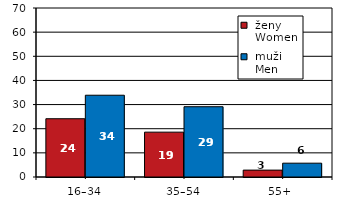
| Category |  ženy 
 Women |  muži 
 Men |
|---|---|---|
| 16–34 | 24.134 | 33.873 |
| 35–54 | 18.58 | 29.105 |
| 55+  | 2.85 | 5.724 |